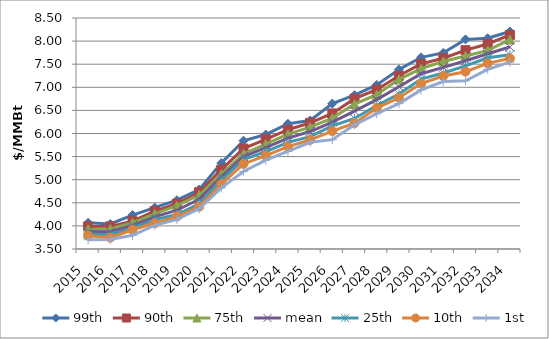
| Category | 99th | 90th | 75th | mean | 25th | 10th | 1st |
|---|---|---|---|---|---|---|---|
| 2015.0 | 4.067 | 3.988 | 3.928 | 3.879 | 3.826 | 3.789 | 3.702 |
| 2016.0 | 4.041 | 3.99 | 3.934 | 3.872 | 3.809 | 3.744 | 3.704 |
| 2017.0 | 4.235 | 4.102 | 4.07 | 4.009 | 3.953 | 3.917 | 3.796 |
| 2018.0 | 4.394 | 4.319 | 4.261 | 4.195 | 4.136 | 4.056 | 4.012 |
| 2019.0 | 4.556 | 4.479 | 4.437 | 4.339 | 4.246 | 4.204 | 4.142 |
| 2020.0 | 4.786 | 4.729 | 4.667 | 4.575 | 4.476 | 4.417 | 4.372 |
| 2021.0 | 5.36 | 5.217 | 5.122 | 5.062 | 4.993 | 4.904 | 4.824 |
| 2022.0 | 5.843 | 5.673 | 5.562 | 5.501 | 5.435 | 5.341 | 5.179 |
| 2023.0 | 5.977 | 5.875 | 5.772 | 5.692 | 5.607 | 5.521 | 5.421 |
| 2024.0 | 6.211 | 6.082 | 5.986 | 5.901 | 5.808 | 5.715 | 5.611 |
| 2025.0 | 6.282 | 6.231 | 6.138 | 6.043 | 5.931 | 5.861 | 5.81 |
| 2026.0 | 6.648 | 6.434 | 6.334 | 6.246 | 6.167 | 6.052 | 5.867 |
| 2027.0 | 6.83 | 6.753 | 6.638 | 6.486 | 6.325 | 6.225 | 6.187 |
| 2028.0 | 7.05 | 6.948 | 6.84 | 6.732 | 6.606 | 6.55 | 6.428 |
| 2029.0 | 7.386 | 7.249 | 7.173 | 7.013 | 6.854 | 6.773 | 6.647 |
| 2030.0 | 7.648 | 7.508 | 7.403 | 7.293 | 7.179 | 7.08 | 6.943 |
| 2031.0 | 7.745 | 7.629 | 7.559 | 7.432 | 7.31 | 7.245 | 7.124 |
| 2032.0 | 8.037 | 7.805 | 7.678 | 7.574 | 7.464 | 7.338 | 7.141 |
| 2033.0 | 8.061 | 7.938 | 7.798 | 7.725 | 7.64 | 7.518 | 7.389 |
| 2034.0 | 8.207 | 8.133 | 8.033 | 7.872 | 7.706 | 7.625 | 7.544 |